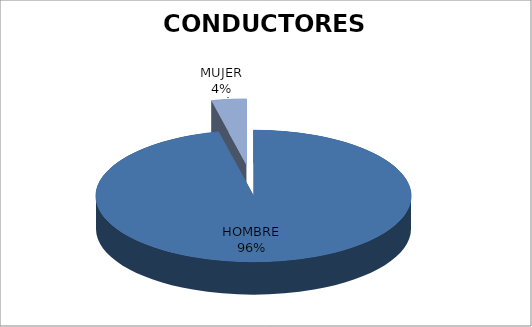
| Category | E.E. |
|---|---|
| HOMBRE | 27 |
| MUJER | 1 |